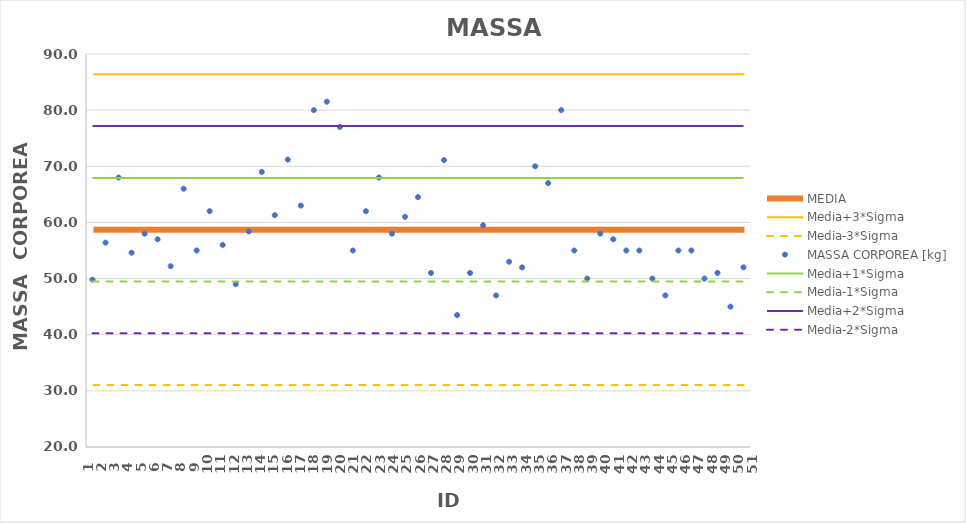
| Category | MEDIA | Media+3*Sigma | Media-3*Sigma |
|---|---|---|---|
| 1.0 | 58.706 | 86.382 | 31.029 |
| 2.0 | 58.706 | 86.382 | 31.029 |
| 3.0 | 58.706 | 86.382 | 31.029 |
| 4.0 | 58.706 | 86.382 | 31.029 |
| 5.0 | 58.706 | 86.382 | 31.029 |
| 6.0 | 58.706 | 86.382 | 31.029 |
| 7.0 | 58.706 | 86.382 | 31.029 |
| 8.0 | 58.706 | 86.382 | 31.029 |
| 9.0 | 58.706 | 86.382 | 31.029 |
| 10.0 | 58.706 | 86.382 | 31.029 |
| 11.0 | 58.706 | 86.382 | 31.029 |
| 12.0 | 58.706 | 86.382 | 31.029 |
| 13.0 | 58.706 | 86.382 | 31.029 |
| 14.0 | 58.706 | 86.382 | 31.029 |
| 15.0 | 58.706 | 86.382 | 31.029 |
| 16.0 | 58.706 | 86.382 | 31.029 |
| 17.0 | 58.706 | 86.382 | 31.029 |
| 18.0 | 58.706 | 86.382 | 31.029 |
| 19.0 | 58.706 | 86.382 | 31.029 |
| 20.0 | 58.706 | 86.382 | 31.029 |
| 21.0 | 58.706 | 86.382 | 31.029 |
| 22.0 | 58.706 | 86.382 | 31.029 |
| 23.0 | 58.706 | 86.382 | 31.029 |
| 24.0 | 58.706 | 86.382 | 31.029 |
| 25.0 | 58.706 | 86.382 | 31.029 |
| 26.0 | 58.706 | 86.382 | 31.029 |
| 27.0 | 58.706 | 86.382 | 31.029 |
| 28.0 | 58.706 | 86.382 | 31.029 |
| 29.0 | 58.706 | 86.382 | 31.029 |
| 30.0 | 58.706 | 86.382 | 31.029 |
| 31.0 | 58.706 | 86.382 | 31.029 |
| 32.0 | 58.706 | 86.382 | 31.029 |
| 33.0 | 58.706 | 86.382 | 31.029 |
| 34.0 | 58.706 | 86.382 | 31.029 |
| 35.0 | 58.706 | 86.382 | 31.029 |
| 36.0 | 58.706 | 86.382 | 31.029 |
| 37.0 | 58.706 | 86.382 | 31.029 |
| 38.0 | 58.706 | 86.382 | 31.029 |
| 39.0 | 58.706 | 86.382 | 31.029 |
| 40.0 | 58.706 | 86.382 | 31.029 |
| 41.0 | 58.706 | 86.382 | 31.029 |
| 42.0 | 58.706 | 86.382 | 31.029 |
| 43.0 | 58.706 | 86.382 | 31.029 |
| 44.0 | 58.706 | 86.382 | 31.029 |
| 45.0 | 58.706 | 86.382 | 31.029 |
| 46.0 | 58.706 | 86.382 | 31.029 |
| 47.0 | 58.706 | 86.382 | 31.029 |
| 48.0 | 58.706 | 86.382 | 31.029 |
| 49.0 | 58.706 | 86.382 | 31.029 |
| 50.0 | 58.706 | 86.382 | 31.029 |
| 51.0 | 58.706 | 86.382 | 31.029 |